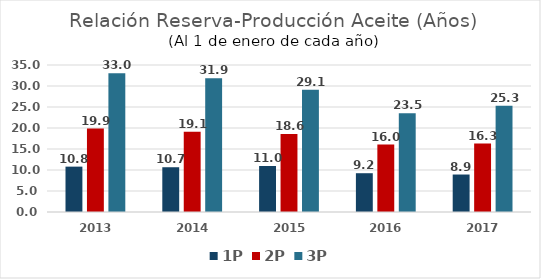
| Category | 1P | 2P | 3P |
|---|---|---|---|
| 2013.0 | 10.802 | 19.871 | 33.046 |
| 2014.0 | 10.659 | 19.132 | 31.858 |
| 2015.0 | 10.954 | 18.585 | 29.132 |
| 2016.0 | 9.235 | 16.042 | 23.513 |
| 2017.0 | 8.924 | 16.294 | 25.324 |